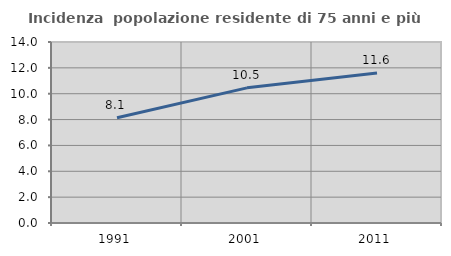
| Category | Incidenza  popolazione residente di 75 anni e più |
|---|---|
| 1991.0 | 8.142 |
| 2001.0 | 10.453 |
| 2011.0 | 11.593 |